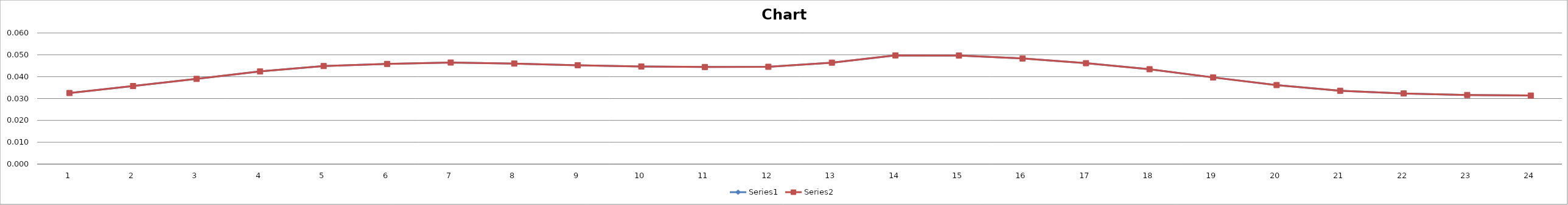
| Category | Series 0 | Series 1 |
|---|---|---|
| 0 | 0.033 | 0.033 |
| 1 | 0.036 | 0.036 |
| 2 | 0.039 | 0.039 |
| 3 | 0.042 | 0.042 |
| 4 | 0.045 | 0.045 |
| 5 | 0.046 | 0.046 |
| 6 | 0.046 | 0.046 |
| 7 | 0.046 | 0.046 |
| 8 | 0.045 | 0.045 |
| 9 | 0.045 | 0.045 |
| 10 | 0.044 | 0.044 |
| 11 | 0.045 | 0.045 |
| 12 | 0.046 | 0.046 |
| 13 | 0.05 | 0.05 |
| 14 | 0.05 | 0.05 |
| 15 | 0.048 | 0.048 |
| 16 | 0.046 | 0.046 |
| 17 | 0.043 | 0.043 |
| 18 | 0.04 | 0.04 |
| 19 | 0.036 | 0.036 |
| 20 | 0.034 | 0.034 |
| 21 | 0.032 | 0.032 |
| 22 | 0.032 | 0.032 |
| 23 | 0.031 | 0.031 |